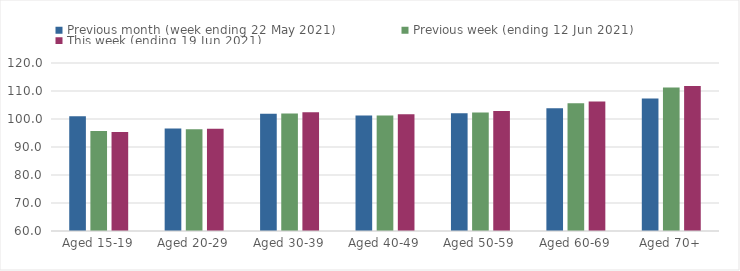
| Category | Previous month (week ending 22 May 2021) | Previous week (ending 12 Jun 2021) | This week (ending 19 Jun 2021) |
|---|---|---|---|
| Aged 15-19 | 101 | 95.71 | 95.4 |
| Aged 20-29 | 96.61 | 96.3 | 96.48 |
| Aged 30-39 | 101.86 | 101.98 | 102.41 |
| Aged 40-49 | 101.23 | 101.25 | 101.7 |
| Aged 50-59 | 102.08 | 102.35 | 102.84 |
| Aged 60-69 | 103.82 | 105.6 | 106.22 |
| Aged 70+ | 107.34 | 111.21 | 111.75 |